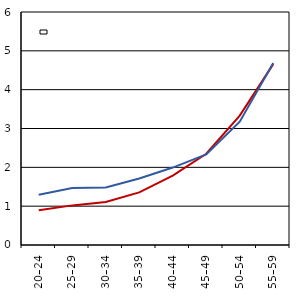
| Category | (%) ženy 
(%) Women | (%) muži 
(%)  Men |
|---|---|---|
| 20–24 | 0.893 | 1.293 |
| 25–29 | 1.02 | 1.468 |
| 30–34 | 1.108 | 1.482 |
| 35–39 | 1.355 | 1.712 |
| 40–44 | 1.785 | 1.994 |
| 45–49 | 2.349 | 2.33 |
| 50–54 | 3.331 | 3.174 |
| 55–59 | 4.657 | 4.688 |